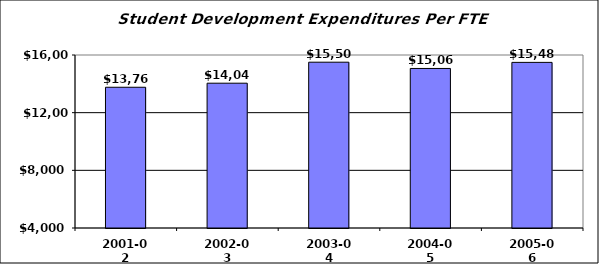
| Category | Per FTE Student |
|---|---|
| 2001-02 | 13762.182 |
| 2002-03 | 14044.489 |
| 2003-04 | 15501.317 |
| 2004-05 | 15066.147 |
| 2005-06 | 15488.139 |